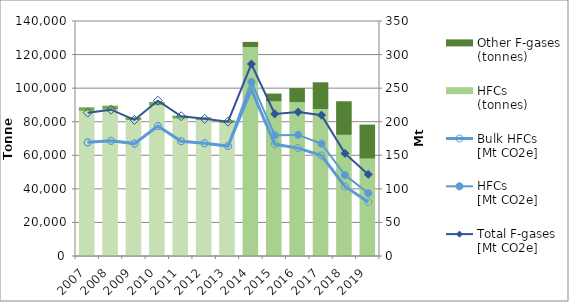
| Category | HFCs 
(tonnes) | Other F-gases (tonnes) |
|---|---|---|
| 2007.0 | 86476.657 | 2109.511 |
| 2008.0 | 87311.009 | 2257.825 |
| 2009.0 | 81004.75 | 1676.104 |
| 2010.0 | 89923.848 | 1824.904 |
| 2011.0 | 81829.224 | 1790.919 |
| 2012.0 | 80982.041 | 1732.937 |
| 2013.0 | 79224.032 | 1673.997 |
| 2014.0 | 124408.196 | 3139.292 |
| 2015.0 | 92090.332 | 4688.256 |
| 2016.0 | 91593.255 | 8456.967 |
| 2017.0 | 87581.938 | 15893.274 |
| 2018.0 | 72178.791 | 20000.452 |
| 2019.0 | 58014.731 | 20278.125 |